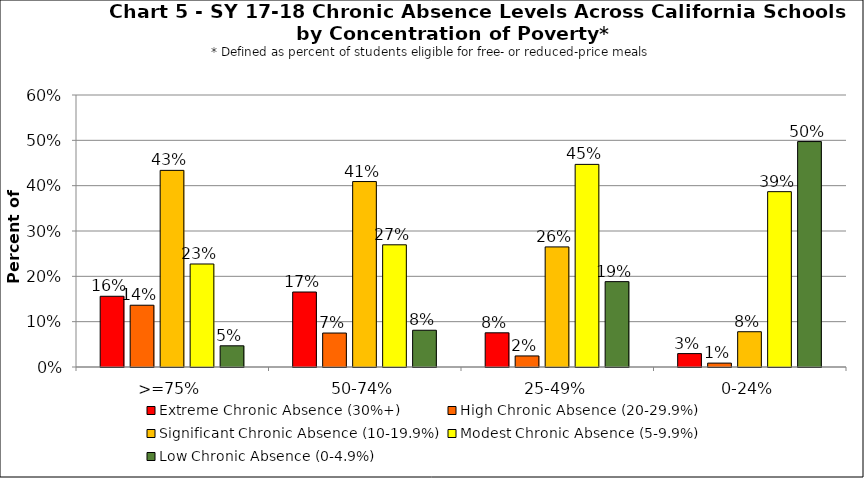
| Category | Extreme Chronic Absence (30%+) | High Chronic Absence (20-29.9%) | Significant Chronic Absence (10-19.9%) | Modest Chronic Absence (5-9.9%) | Low Chronic Absence (0-4.9%) |
|---|---|---|---|---|---|
| 0 | 0.156 | 0.136 | 0.434 | 0.227 | 0.047 |
| 1 | 0.165 | 0.075 | 0.409 | 0.27 | 0.081 |
| 2 | 0.075 | 0.024 | 0.265 | 0.447 | 0.188 |
| 3 | 0.03 | 0.009 | 0.078 | 0.387 | 0.497 |